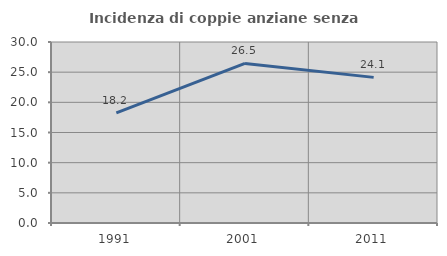
| Category | Incidenza di coppie anziane senza figli  |
|---|---|
| 1991.0 | 18.243 |
| 2001.0 | 26.452 |
| 2011.0 | 24.138 |